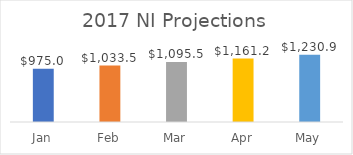
| Category | Series 0 |
|---|---|
| Jan | 975 |
| Feb | 1033.5 |
| Mar | 1095.51 |
| Apr | 1161.241 |
| May | 1230.915 |